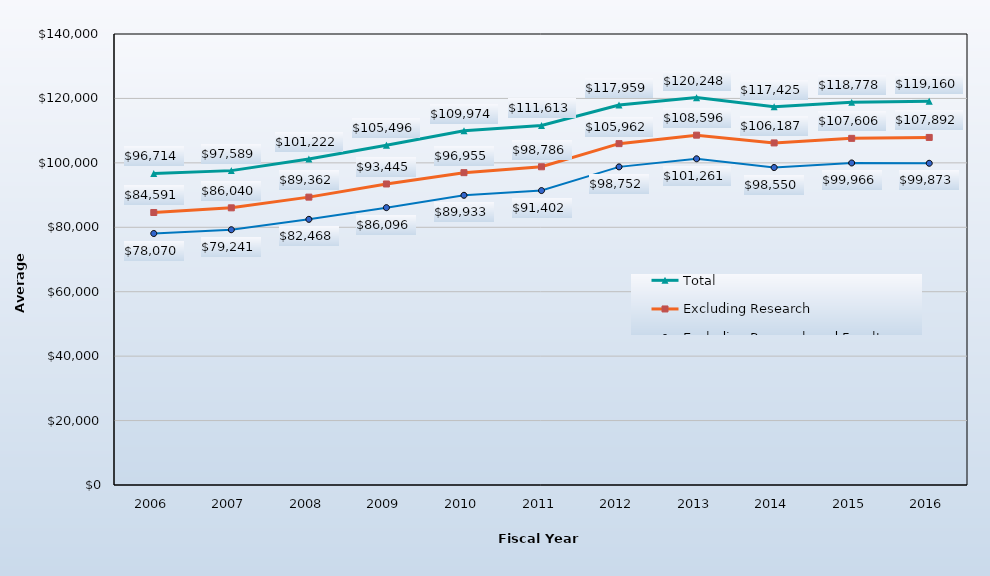
| Category | Total | Excluding Research | Excluding Research and Faculty Practice |
|---|---|---|---|
| 2006.0 | 96714 | 84591 | 78070 |
| 2007.0 | 97589 | 86040 | 79241 |
| 2008.0 | 101222 | 89362 | 82468 |
| 2009.0 | 105496 | 93445 | 86096 |
| 2010.0 | 109974 | 96955 | 89933 |
| 2011.0 | 111613 | 98786 | 91402 |
| 2012.0 | 117959 | 105962 | 98752 |
| 2013.0 | 120248 | 108596 | 101261 |
| 2014.0 | 117425 | 106187 | 98550 |
| 2015.0 | 118778 | 107606 | 99966 |
| 2016.0 | 119160 | 107892 | 99873 |